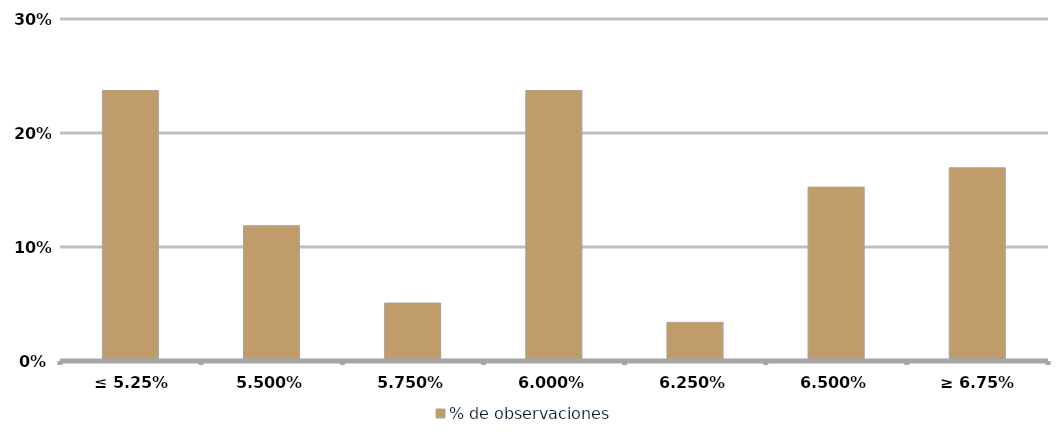
| Category | % de observaciones  |
|---|---|
| ≤ 5.25% | 0.237 |
| 5,50% | 0.119 |
| 5,75% | 0.051 |
| 6,00% | 0.237 |
| 6,25% | 0.034 |
| 6,50% | 0.153 |
| ≥ 6.75% | 0.169 |